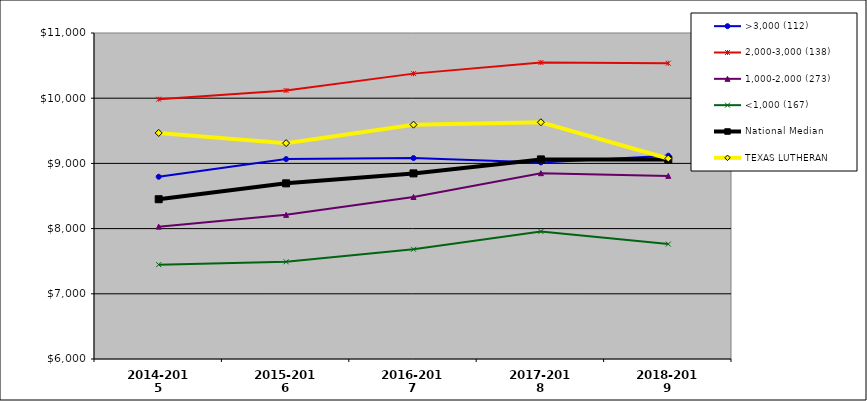
| Category | >3,000 (112) | 2,000-3,000 (138) | 1,000-2,000 (273) | <1,000 (167) | National Median | TEXAS LUTHERAN |
|---|---|---|---|---|---|---|
| 2014-2015 | 8795.112 | 9985.073 | 8030.12 | 7447.215 | 8450.558 | 9467.017 |
| 2015-2016 | 9066.183 | 10118.125 | 8210.7 | 7491.002 | 8693.909 | 9310.984 |
| 2016-2017 | 9081.593 | 10376.969 | 8485.044 | 7683.306 | 8846.742 | 9594.193 |
| 2017-2018 | 9015.037 | 10547.485 | 8850.087 | 7956.384 | 9061.41 | 9631.144 |
| 2018-2019 | 9117.824 | 10536.235 | 8808.64 | 7762.545 | 9059.978 | 9075.626 |